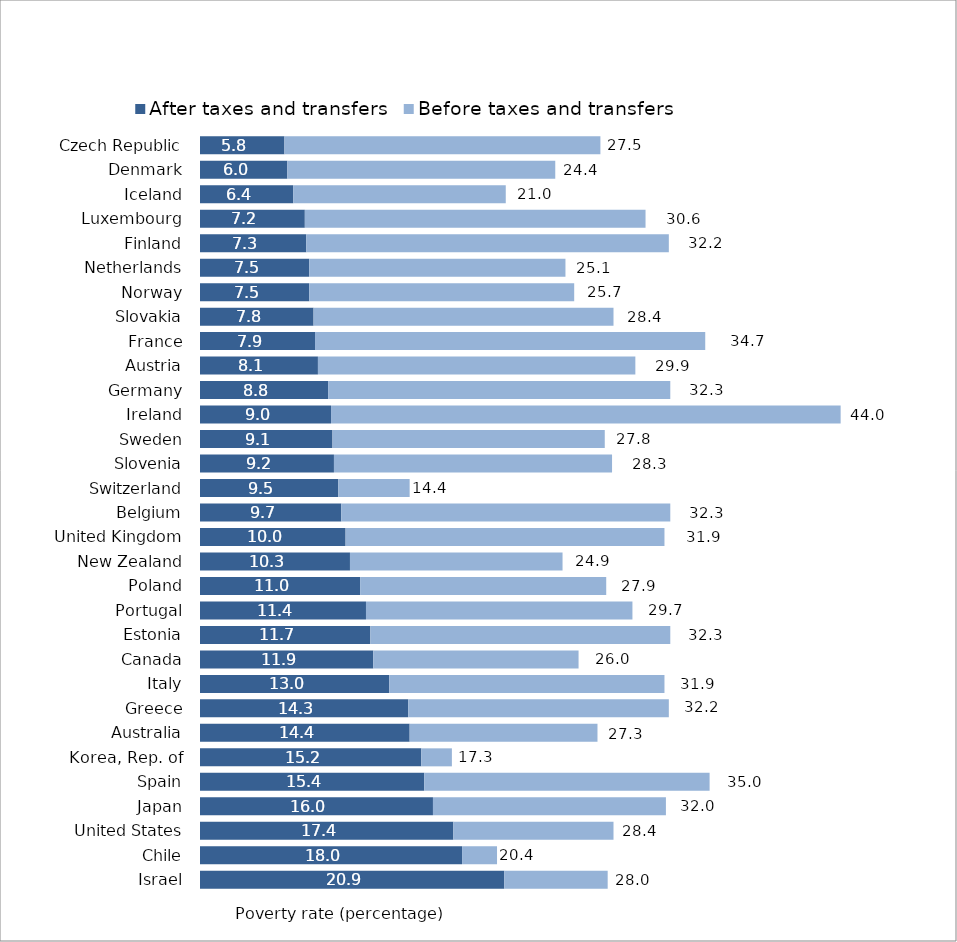
| Category | After taxes and transfers | Before taxes and transfers |
|---|---|---|
| Israel | 20.9 | 7.1 |
| Chile | 18 | 2.4 |
| United States | 17.4 | 11 |
| Japan | 16 | 16 |
| Spain | 15.4 | 19.6 |
| Korea, Rep. of | 15.2 | 2.1 |
| Australia | 14.4 | 12.9 |
| Greece | 14.3 | 17.9 |
| Italy | 13 | 18.9 |
| Canada | 11.9 | 14.1 |
| Estonia | 11.7 | 20.6 |
| Portugal | 11.4 | 18.3 |
| Poland | 11 | 16.9 |
| New Zealand | 10.3 | 14.6 |
| United Kingdom | 10 | 21.9 |
| Belgium | 9.7 | 22.6 |
| Switzerland | 9.5 | 4.9 |
| Slovenia | 9.2 | 19.1 |
| Sweden | 9.1 | 18.7 |
| Ireland | 9 | 35 |
| Germany | 8.8 | 23.5 |
| Austria | 8.1 | 21.8 |
| France | 7.9 | 26.8 |
| Slovakia | 7.8 | 20.6 |
| Norway | 7.5 | 18.2 |
| Netherlands | 7.5 | 17.6 |
| Finland | 7.3 | 24.9 |
| Luxembourg | 7.2 | 23.4 |
| Iceland | 6.4 | 14.6 |
| Denmark | 6 | 18.4 |
| Czech Republic | 5.8 | 21.7 |